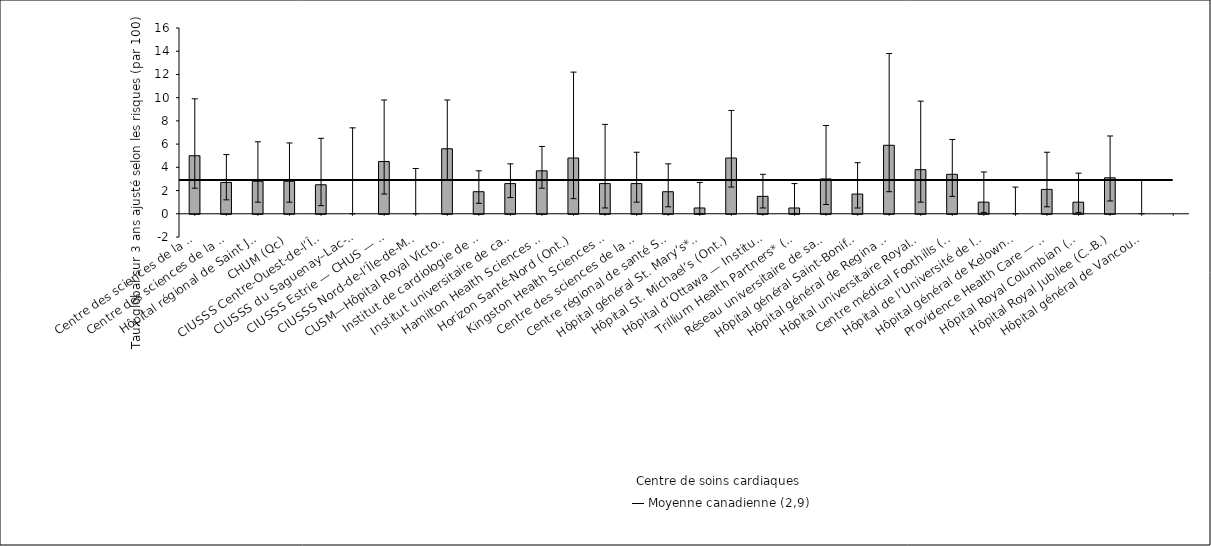
| Category | Taux ajusté selon 
les risques |
|---|---|
| Centre des sciences de la santé — St. John’s (T. -N.-L.) | 5 |
| Centre des sciences de la santé Queen Elizabeth II (N.-É.) | 2.7 |
| Hôpital régional de Saint John (N.-B.) | 2.8 |
| CHUM (Qc) | 2.8 |
| CIUSSS Centre-Ouest-de-l’Île-de-Mtl — Hôpital général juif (Qc) | 2.5 |
| CIUSSS du Saguenay–Lac-St-Jean — Hôpital de Chicoutimi (Qc) | 0 |
| CIUSSS Estrie — CHUS — Hôpital Fleurimont (Qc) | 4.5 |
| CIUSSS Nord-de-l’Île-de-Montréal — Hôpital du Sacré-Cœur de Montréal (Qc) | 0 |
| CUSM—Hôpital Royal Victoria (Qc) | 5.6 |
| Institut de cardiologie de Montréal (Qc) | 1.9 |
| Institut universitaire de cardiologie et pneumologie de Québec (Qc) | 2.6 |
| Hamilton Health Sciences (Ont.) | 3.7 |
| Horizon Santé-Nord (Ont.) | 4.8 |
| Kingston Health Sciences Centre (Ont.) | 2.6 |
| Centre des sciences de la santé de London (Ont.) | 2.6 |
| Centre régional de santé Southlake (Ont.) | 1.9 |
| Hôpital général St. Mary’s* (Ont.) | 0.5 |
| Hôpital St. Michael’s (Ont.) | 4.8 |
| Hôpital d’Ottawa — Institut de cardiologie de l’Université d’Ottawa (Ont.) | 1.5 |
| Trillium Health Partners* (Ont.) | 0.5 |
| Réseau universitaire de santé (Ont.) | 3 |
| Hôpital général Saint-Boniface (Man.) | 1.7 |
| Hôpital général de Regina (Sask.) | 5.9 |
| Hôpital universitaire Royal (Sask.) | 3.8 |
| Centre médical Foothills (Alb.) | 3.4 |
| Hôpital de l’Université de l’Alberta (Alb.) | 1 |
| Hôpital général de Kelowna* (C.-B.) | 0 |
| Providence Health Care — Hôpital St. Paul’s (Vancouver) (C.-B.) | 2.1 |
| Hôpital Royal Columbian (C.-B.) | 1 |
| Hôpital Royal Jubilee (C.-B.) | 3.1 |
| Hôpital général de Vancouver (C.-B.) | 0 |